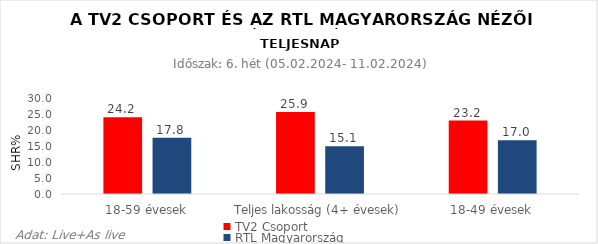
| Category | TV2 Csoport | RTL Magyarország |
|---|---|---|
| 18-59 évesek | 24.2 | 17.8 |
| Teljes lakosság (4+ évesek) | 25.9 | 15.1 |
| 18-49 évesek | 23.2 | 17 |